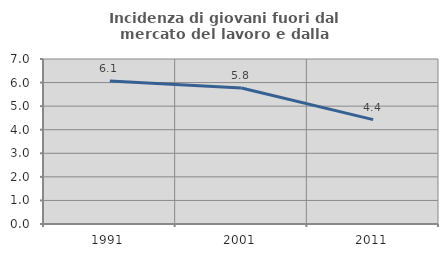
| Category | Incidenza di giovani fuori dal mercato del lavoro e dalla formazione  |
|---|---|
| 1991.0 | 6.07 |
| 2001.0 | 5.769 |
| 2011.0 | 4.428 |